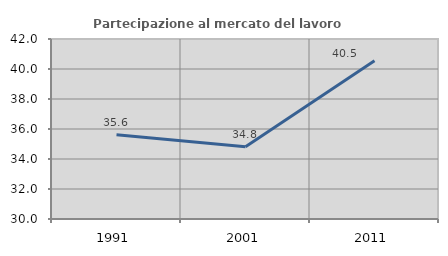
| Category | Partecipazione al mercato del lavoro  femminile |
|---|---|
| 1991.0 | 35.614 |
| 2001.0 | 34.815 |
| 2011.0 | 40.547 |